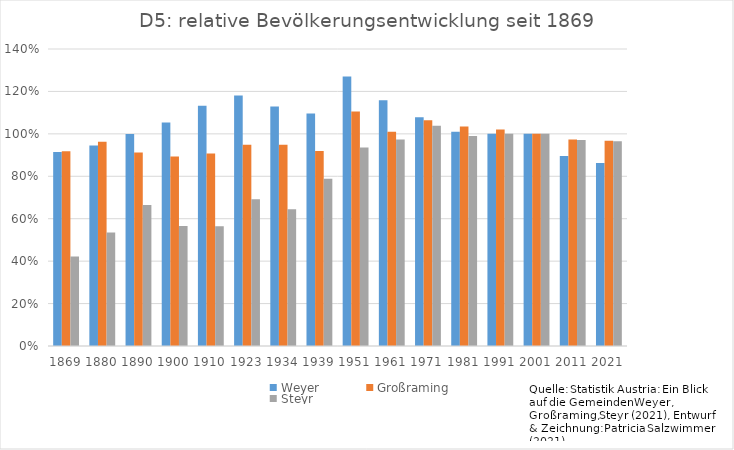
| Category | Weyer | Großraming | Steyr  |
|---|---|---|---|
| 1869.0 | 0.915 | 0.918 | 0.422 |
| 1880.0 | 0.946 | 0.963 | 0.535 |
| 1890.0 | 0.999 | 0.912 | 0.664 |
| 1900.0 | 1.054 | 0.893 | 0.566 |
| 1910.0 | 1.133 | 0.908 | 0.564 |
| 1923.0 | 1.181 | 0.948 | 0.691 |
| 1934.0 | 1.129 | 0.949 | 0.644 |
| 1939.0 | 1.096 | 0.919 | 0.788 |
| 1951.0 | 1.271 | 1.105 | 0.936 |
| 1961.0 | 1.158 | 1.01 | 0.974 |
| 1971.0 | 1.079 | 1.064 | 1.038 |
| 1981.0 | 1.01 | 1.035 | 0.99 |
| 1991.0 | 1.001 | 1.021 | 1 |
| 2001.0 | 1 | 1 | 1 |
| 2011.0 | 0.896 | 0.974 | 0.971 |
| 2021.0 | 0.863 | 0.968 | 0.965 |